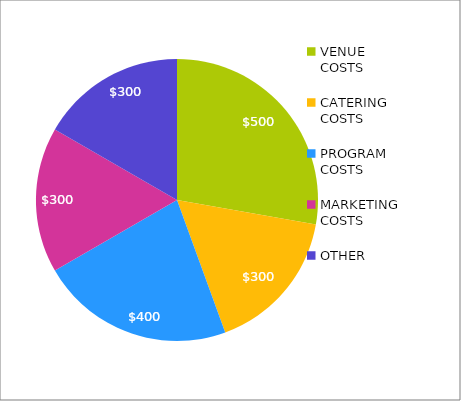
| Category | Series 0 |
|---|---|
| VENUE COSTS | 500 |
| CATERING COSTS | 300 |
| PROGRAM COSTS | 400 |
| MARKETING COSTS | 300 |
| OTHER | 300 |